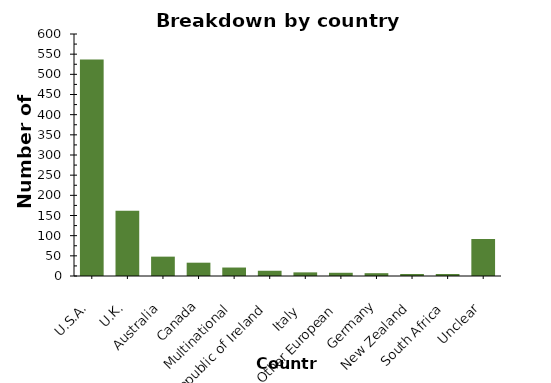
| Category | Series 0 |
|---|---|
| U.S.A. | 537 |
| U.K. | 162 |
| Australia | 48 |
| Canada | 33 |
| Multinational | 21 |
| Republic of Ireland | 13 |
| Italy  | 9 |
| Other European | 8 |
| Germany | 7 |
| New Zealand | 5 |
| South Africa | 5 |
| Unclear | 92 |